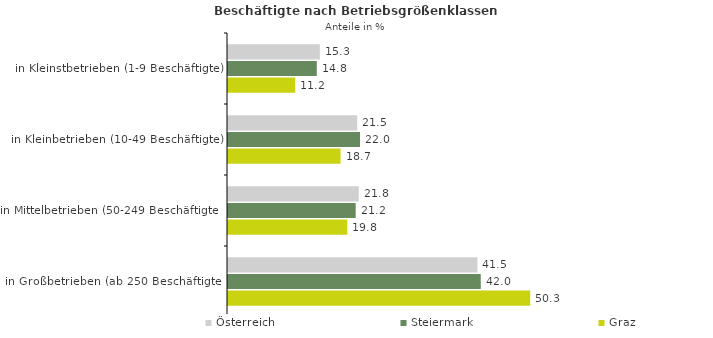
| Category | Österreich | Steiermark | Graz |
|---|---|---|---|
| in Kleinstbetrieben (1-9 Beschäftigte) | 15.273 | 14.768 | 11.173 |
| in Kleinbetrieben (10-49 Beschäftigte) | 21.487 | 21.955 | 18.722 |
| in Mittelbetrieben (50-249 Beschäftigte) | 21.75 | 21.237 | 19.841 |
| in Großbetrieben (ab 250 Beschäftigte) | 41.489 | 42.04 | 50.265 |